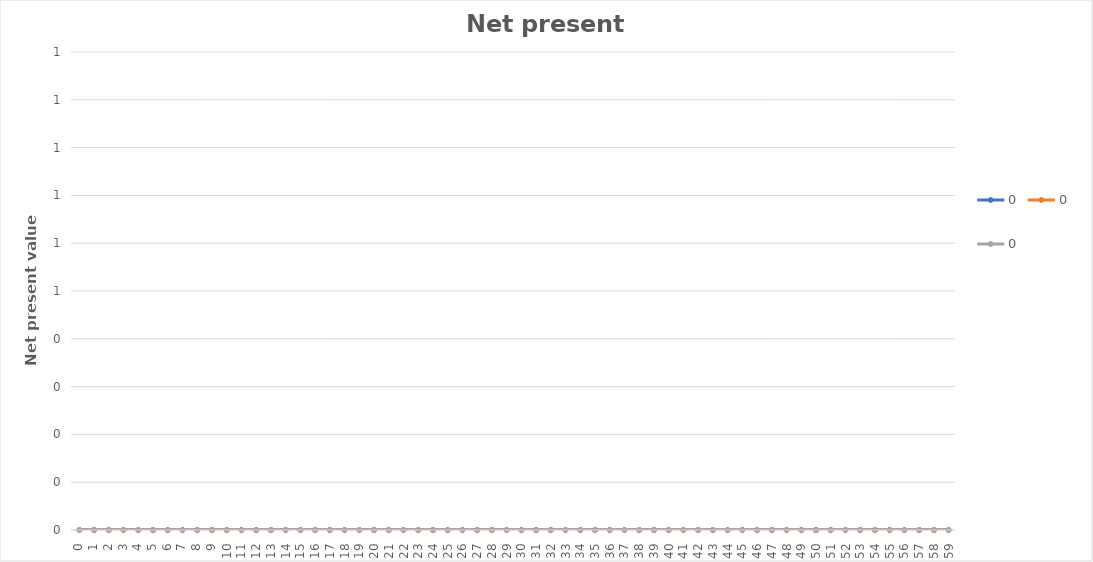
| Category | 0 |
|---|---|
| 0.0 | 0 |
| 1.0 | 0 |
| 2.0 | 0 |
| 3.0 | 0 |
| 4.0 | 0 |
| 5.0 | 0 |
| 6.0 | 0 |
| 7.0 | 0 |
| 8.0 | 0 |
| 9.0 | 0 |
| 10.0 | 0 |
| 11.0 | 0 |
| 12.0 | 0 |
| 13.0 | 0 |
| 14.0 | 0 |
| 15.0 | 0 |
| 16.0 | 0 |
| 17.0 | 0 |
| 18.0 | 0 |
| 19.0 | 0 |
| 20.0 | 0 |
| 21.0 | 0 |
| 22.0 | 0 |
| 23.0 | 0 |
| 24.0 | 0 |
| 25.0 | 0 |
| 26.0 | 0 |
| 27.0 | 0 |
| 28.0 | 0 |
| 29.0 | 0 |
| 30.0 | 0 |
| 31.0 | 0 |
| 32.0 | 0 |
| 33.0 | 0 |
| 34.0 | 0 |
| 35.0 | 0 |
| 36.0 | 0 |
| 37.0 | 0 |
| 38.0 | 0 |
| 39.0 | 0 |
| 40.0 | 0 |
| 41.0 | 0 |
| 42.0 | 0 |
| 43.0 | 0 |
| 44.0 | 0 |
| 45.0 | 0 |
| 46.0 | 0 |
| 47.0 | 0 |
| 48.0 | 0 |
| 49.0 | 0 |
| 50.0 | 0 |
| 51.0 | 0 |
| 52.0 | 0 |
| 53.0 | 0 |
| 54.0 | 0 |
| 55.0 | 0 |
| 56.0 | 0 |
| 57.0 | 0 |
| 58.0 | 0 |
| 59.0 | 0 |